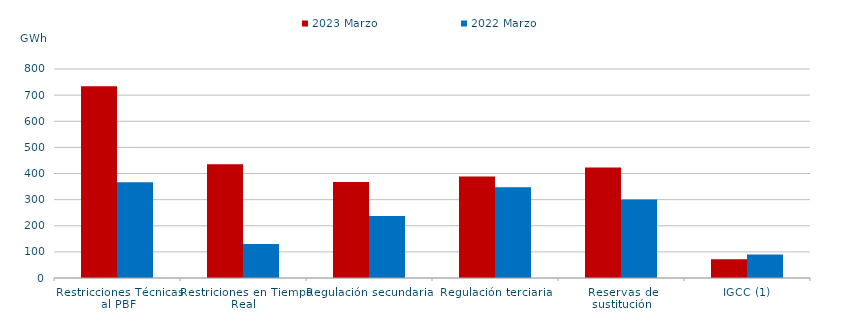
| Category | 2023 Marzo | 2022 Marzo |
|---|---|---|
| Restricciones Técnicas al PBF | 733.572 | 366.52 |
| Restriciones en Tiempo Real | 435.675 | 130.177 |
| Regulación secundaria | 367.893 | 237.579 |
| Regulación terciaria | 388.232 | 347.786 |
| Reservas de sustitución | 422.591 | 300.018 |
| IGCC (1) | 71.927 | 90.192 |